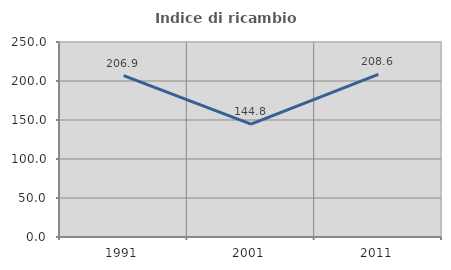
| Category | Indice di ricambio occupazionale  |
|---|---|
| 1991.0 | 206.897 |
| 2001.0 | 144.828 |
| 2011.0 | 208.571 |